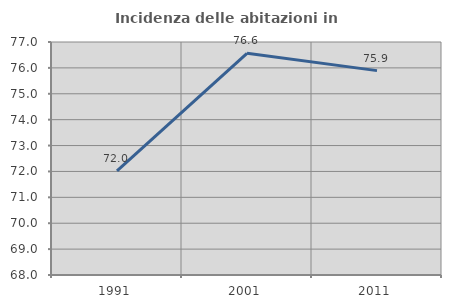
| Category | Incidenza delle abitazioni in proprietà  |
|---|---|
| 1991.0 | 72.023 |
| 2001.0 | 76.564 |
| 2011.0 | 75.894 |